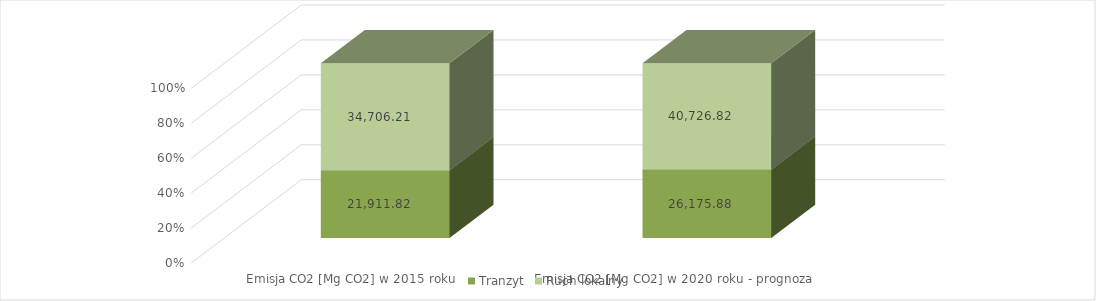
| Category | Tranzyt | Ruch lokalny |
|---|---|---|
| Emisja CO2 [Mg CO2] w 2015 roku | 21911.822 | 34706.21 |
| Emisja CO2 [Mg CO2] w 2020 roku - prognoza | 26175.877 | 40726.815 |